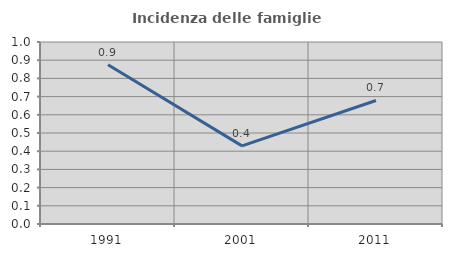
| Category | Incidenza delle famiglie numerose |
|---|---|
| 1991.0 | 0.875 |
| 2001.0 | 0.429 |
| 2011.0 | 0.679 |